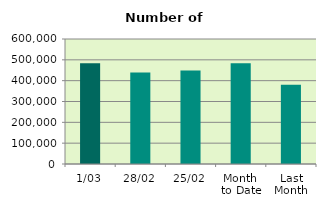
| Category | Series 0 |
|---|---|
| 1/03 | 484034 |
| 28/02 | 439128 |
| 25/02 | 449008 |
| Month 
to Date | 484034 |
| Last
Month | 380345.4 |